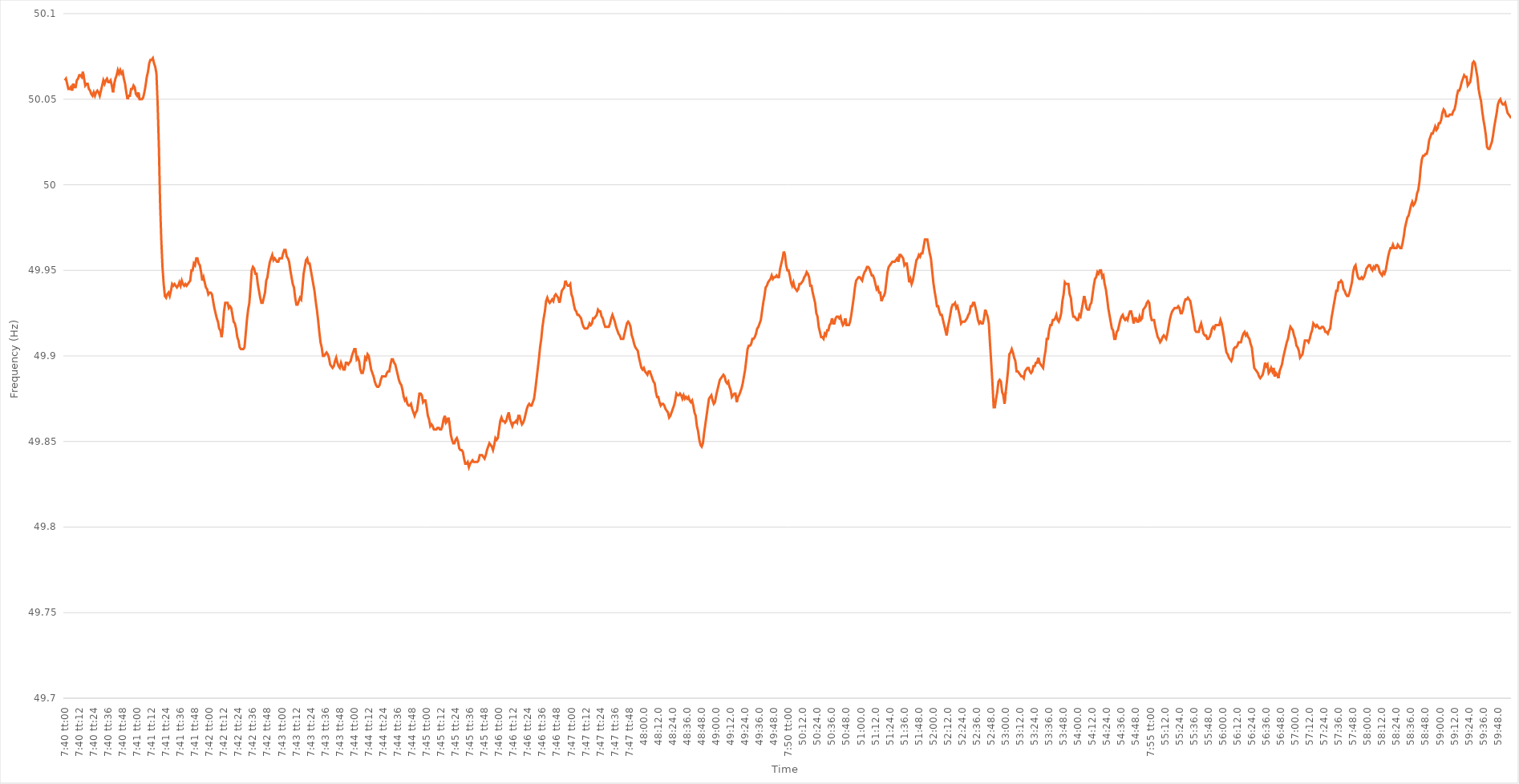
| Category | Series 0 |
|---|---|
| 0.3194444444444445 | 50.061 |
| 0.3194560185185185 | 50.062 |
| 0.31946759259259255 | 50.059 |
| 0.3194791666666667 | 50.056 |
| 0.31949074074074074 | 50.056 |
| 0.31950231481481484 | 50.057 |
| 0.3195138888888889 | 50.055 |
| 0.31952546296296297 | 50.059 |
| 0.319537037037037 | 50.057 |
| 0.3195486111111111 | 50.057 |
| 0.3195601851851852 | 50.061 |
| 0.31957175925925924 | 50.062 |
| 0.31958333333333333 | 50.064 |
| 0.3195949074074074 | 50.064 |
| 0.31960648148148146 | 50.063 |
| 0.31961805555555556 | 50.066 |
| 0.31962962962962965 | 50.062 |
| 0.3196412037037037 | 50.058 |
| 0.3196527777777778 | 50.059 |
| 0.3196643518518519 | 50.059 |
| 0.3196759259259259 | 50.056 |
| 0.3196875 | 50.055 |
| 0.3196990740740741 | 50.053 |
| 0.31971064814814815 | 50.052 |
| 0.31972222222222224 | 50.054 |
| 0.3197337962962963 | 50.052 |
| 0.3197453703703704 | 50.054 |
| 0.3197569444444444 | 50.055 |
| 0.3197685185185185 | 50.054 |
| 0.3197800925925926 | 50.052 |
| 0.31979166666666664 | 50.055 |
| 0.31980324074074074 | 50.058 |
| 0.31981481481481483 | 50.061 |
| 0.31982638888888887 | 50.059 |
| 0.31983796296296296 | 50.061 |
| 0.31984953703703706 | 50.062 |
| 0.3198611111111111 | 50.06 |
| 0.3198726851851852 | 50.06 |
| 0.3198842592592593 | 50.061 |
| 0.3198958333333333 | 50.058 |
| 0.3199074074074074 | 50.054 |
| 0.3199189814814815 | 50.059 |
| 0.31993055555555555 | 50.062 |
| 0.31994212962962965 | 50.064 |
| 0.3199537037037037 | 50.067 |
| 0.3199652777777778 | 50.065 |
| 0.3199768518518518 | 50.067 |
| 0.3199884259259259 | 50.065 |
| 0.32 | 50.066 |
| 0.32001157407407405 | 50.062 |
| 0.32002314814814814 | 50.059 |
| 0.32003472222222223 | 50.054 |
| 0.3200462962962963 | 50.05 |
| 0.32005787037037037 | 50.052 |
| 0.32006944444444446 | 50.052 |
| 0.3200810185185185 | 50.056 |
| 0.3200925925925926 | 50.056 |
| 0.3201041666666667 | 50.058 |
| 0.32011574074074073 | 50.057 |
| 0.3201273148148148 | 50.053 |
| 0.3201388888888889 | 50.052 |
| 0.32015046296296296 | 50.054 |
| 0.32016203703703705 | 50.05 |
| 0.3201736111111111 | 50.05 |
| 0.3201851851851852 | 50.05 |
| 0.3201967592592592 | 50.051 |
| 0.3202083333333334 | 50.054 |
| 0.3202199074074074 | 50.058 |
| 0.32023148148148145 | 50.063 |
| 0.32024305555555554 | 50.066 |
| 0.32025462962962964 | 50.071 |
| 0.3202662037037037 | 50.073 |
| 0.3202777777777778 | 50.073 |
| 0.32028935185185187 | 50.074 |
| 0.3203009259259259 | 50.071 |
| 0.3203125 | 50.069 |
| 0.3203240740740741 | 50.065 |
| 0.32033564814814813 | 50.047 |
| 0.3203472222222222 | 50.023 |
| 0.3203587962962963 | 49.99 |
| 0.32037037037037036 | 49.968 |
| 0.32038194444444446 | 49.952 |
| 0.32039351851851855 | 49.942 |
| 0.3204050925925926 | 49.935 |
| 0.3204166666666666 | 49.934 |
| 0.3204282407407408 | 49.936 |
| 0.3204398148148148 | 49.937 |
| 0.3204513888888889 | 49.935 |
| 0.32046296296296295 | 49.938 |
| 0.32047453703703704 | 49.942 |
| 0.3204861111111111 | 49.941 |
| 0.3204976851851852 | 49.942 |
| 0.32050925925925927 | 49.941 |
| 0.3205208333333333 | 49.94 |
| 0.3205324074074074 | 49.941 |
| 0.3205439814814815 | 49.943 |
| 0.32055555555555554 | 49.941 |
| 0.32056712962962963 | 49.944 |
| 0.3205787037037037 | 49.942 |
| 0.32059027777777777 | 49.941 |
| 0.32060185185185186 | 49.942 |
| 0.32061342592592595 | 49.941 |
| 0.320625 | 49.942 |
| 0.3206365740740741 | 49.943 |
| 0.3206481481481482 | 49.944 |
| 0.3206597222222222 | 49.95 |
| 0.3206712962962963 | 49.95 |
| 0.32068287037037035 | 49.954 |
| 0.32069444444444445 | 49.953 |
| 0.3207060185185185 | 49.957 |
| 0.3207175925925926 | 49.957 |
| 0.3207291666666667 | 49.954 |
| 0.3207407407407407 | 49.953 |
| 0.3207523148148148 | 49.949 |
| 0.3207638888888889 | 49.944 |
| 0.32077546296296294 | 49.946 |
| 0.32078703703703704 | 49.943 |
| 0.32079861111111113 | 49.94 |
| 0.32081018518518517 | 49.939 |
| 0.32082175925925926 | 49.936 |
| 0.32083333333333336 | 49.937 |
| 0.3208449074074074 | 49.937 |
| 0.3208564814814815 | 49.936 |
| 0.3208680555555556 | 49.932 |
| 0.3208796296296296 | 49.928 |
| 0.3208912037037037 | 49.925 |
| 0.32090277777777776 | 49.922 |
| 0.32091435185185185 | 49.92 |
| 0.3209259259259259 | 49.916 |
| 0.3209375 | 49.915 |
| 0.3209490740740741 | 49.911 |
| 0.3209606481481481 | 49.917 |
| 0.3209722222222222 | 49.926 |
| 0.3209837962962963 | 49.931 |
| 0.32099537037037035 | 49.931 |
| 0.32100694444444444 | 49.931 |
| 0.32101851851851854 | 49.928 |
| 0.3210300925925926 | 49.929 |
| 0.32104166666666667 | 49.928 |
| 0.32105324074074076 | 49.924 |
| 0.3210648148148148 | 49.92 |
| 0.3210763888888889 | 49.919 |
| 0.321087962962963 | 49.916 |
| 0.32109953703703703 | 49.911 |
| 0.3211111111111111 | 49.909 |
| 0.32112268518518516 | 49.905 |
| 0.32113425925925926 | 49.904 |
| 0.3211458333333333 | 49.904 |
| 0.32115740740740745 | 49.904 |
| 0.3211689814814815 | 49.905 |
| 0.3211805555555555 | 49.913 |
| 0.3211921296296296 | 49.921 |
| 0.3212037037037037 | 49.927 |
| 0.32121527777777775 | 49.931 |
| 0.32122685185185185 | 49.94 |
| 0.32123842592592594 | 49.95 |
| 0.32125 | 49.952 |
| 0.3212615740740741 | 49.951 |
| 0.32127314814814817 | 49.948 |
| 0.3212847222222222 | 49.948 |
| 0.3212962962962963 | 49.942 |
| 0.3213078703703704 | 49.938 |
| 0.32131944444444444 | 49.934 |
| 0.32133101851851853 | 49.931 |
| 0.3213425925925926 | 49.931 |
| 0.32135416666666666 | 49.934 |
| 0.3213657407407407 | 49.937 |
| 0.32137731481481485 | 49.944 |
| 0.3213888888888889 | 49.946 |
| 0.321400462962963 | 49.951 |
| 0.321412037037037 | 49.955 |
| 0.3214236111111111 | 49.957 |
| 0.32143518518518516 | 49.959 |
| 0.32144675925925925 | 49.956 |
| 0.32145833333333335 | 49.957 |
| 0.3214699074074074 | 49.956 |
| 0.3214814814814815 | 49.955 |
| 0.3214930555555556 | 49.955 |
| 0.3215046296296296 | 49.957 |
| 0.3215162037037037 | 49.957 |
| 0.3215277777777778 | 49.957 |
| 0.32153935185185184 | 49.96 |
| 0.32155092592592593 | 49.962 |
| 0.32156250000000003 | 49.962 |
| 0.32157407407407407 | 49.958 |
| 0.32158564814814816 | 49.957 |
| 0.32159722222222226 | 49.955 |
| 0.3216087962962963 | 49.95 |
| 0.3216203703703704 | 49.946 |
| 0.32163194444444443 | 49.942 |
| 0.3216435185185185 | 49.94 |
| 0.32165509259259256 | 49.934 |
| 0.32166666666666666 | 49.93 |
| 0.32167824074074075 | 49.93 |
| 0.3216898148148148 | 49.932 |
| 0.3217013888888889 | 49.934 |
| 0.321712962962963 | 49.933 |
| 0.321724537037037 | 49.94 |
| 0.3217361111111111 | 49.948 |
| 0.3217476851851852 | 49.952 |
| 0.32175925925925924 | 49.956 |
| 0.32177083333333334 | 49.957 |
| 0.32178240740740743 | 49.954 |
| 0.3217939814814815 | 49.954 |
| 0.32180555555555557 | 49.95 |
| 0.32181712962962966 | 49.946 |
| 0.3218287037037037 | 49.942 |
| 0.3218402777777778 | 49.938 |
| 0.32185185185185183 | 49.932 |
| 0.32186342592592593 | 49.927 |
| 0.32187499999999997 | 49.921 |
| 0.32188657407407406 | 49.914 |
| 0.32189814814814816 | 49.908 |
| 0.3219097222222222 | 49.905 |
| 0.3219212962962963 | 49.9 |
| 0.3219328703703704 | 49.9 |
| 0.3219444444444444 | 49.901 |
| 0.3219560185185185 | 49.902 |
| 0.3219675925925926 | 49.901 |
| 0.32197916666666665 | 49.899 |
| 0.32199074074074074 | 49.895 |
| 0.32200231481481484 | 49.894 |
| 0.3220138888888889 | 49.893 |
| 0.32202546296296297 | 49.894 |
| 0.32203703703703707 | 49.897 |
| 0.3220486111111111 | 49.899 |
| 0.3220601851851852 | 49.896 |
| 0.32207175925925924 | 49.894 |
| 0.32208333333333333 | 49.893 |
| 0.32209490740740737 | 49.896 |
| 0.3221064814814815 | 49.894 |
| 0.32211805555555556 | 49.892 |
| 0.3221296296296296 | 49.892 |
| 0.3221412037037037 | 49.896 |
| 0.3221527777777778 | 49.896 |
| 0.3221643518518518 | 49.895 |
| 0.3221759259259259 | 49.896 |
| 0.3221875 | 49.897 |
| 0.32219907407407405 | 49.9 |
| 0.32221064814814815 | 49.902 |
| 0.32222222222222224 | 49.904 |
| 0.3222337962962963 | 49.904 |
| 0.3222453703703704 | 49.898 |
| 0.32225694444444447 | 49.899 |
| 0.3222685185185185 | 49.897 |
| 0.3222800925925926 | 49.892 |
| 0.3222916666666667 | 49.89 |
| 0.32230324074074074 | 49.89 |
| 0.3223148148148148 | 49.893 |
| 0.3223263888888889 | 49.899 |
| 0.32233796296296297 | 49.898 |
| 0.322349537037037 | 49.901 |
| 0.3223611111111111 | 49.9 |
| 0.3223726851851852 | 49.896 |
| 0.32238425925925923 | 49.892 |
| 0.3223958333333333 | 49.89 |
| 0.3224074074074074 | 49.888 |
| 0.32241898148148146 | 49.885 |
| 0.32243055555555555 | 49.883 |
| 0.32244212962962965 | 49.882 |
| 0.3224537037037037 | 49.882 |
| 0.3224652777777778 | 49.883 |
| 0.3224768518518519 | 49.886 |
| 0.3224884259259259 | 49.888 |
| 0.3225 | 49.888 |
| 0.3225115740740741 | 49.888 |
| 0.32252314814814814 | 49.888 |
| 0.32253472222222224 | 49.89 |
| 0.32254629629629633 | 49.891 |
| 0.32255787037037037 | 49.891 |
| 0.32256944444444446 | 49.895 |
| 0.3225810185185185 | 49.898 |
| 0.3225925925925926 | 49.898 |
| 0.32260416666666664 | 49.896 |
| 0.32261574074074073 | 49.895 |
| 0.3226273148148148 | 49.892 |
| 0.32263888888888886 | 49.889 |
| 0.32265046296296296 | 49.886 |
| 0.32266203703703705 | 49.884 |
| 0.3226736111111111 | 49.883 |
| 0.3226851851851852 | 49.88 |
| 0.3226967592592593 | 49.876 |
| 0.3227083333333333 | 49.874 |
| 0.3227199074074074 | 49.875 |
| 0.3227314814814815 | 49.872 |
| 0.32274305555555555 | 49.871 |
| 0.32275462962962964 | 49.871 |
| 0.32276620370370374 | 49.872 |
| 0.3227777777777778 | 49.869 |
| 0.32278935185185187 | 49.867 |
| 0.3228009259259259 | 49.865 |
| 0.3228125 | 49.867 |
| 0.32282407407407404 | 49.868 |
| 0.32283564814814814 | 49.873 |
| 0.32284722222222223 | 49.878 |
| 0.32285879629629627 | 49.878 |
| 0.32287037037037036 | 49.877 |
| 0.32288194444444446 | 49.873 |
| 0.3228935185185185 | 49.874 |
| 0.3229050925925926 | 49.874 |
| 0.3229166666666667 | 49.87 |
| 0.3229282407407407 | 49.865 |
| 0.3229398148148148 | 49.863 |
| 0.3229513888888889 | 49.859 |
| 0.32296296296296295 | 49.86 |
| 0.32297453703703705 | 49.859 |
| 0.32298611111111114 | 49.857 |
| 0.3229976851851852 | 49.857 |
| 0.3230092592592593 | 49.857 |
| 0.3230208333333333 | 49.858 |
| 0.3230324074074074 | 49.858 |
| 0.32304398148148145 | 49.857 |
| 0.3230555555555556 | 49.857 |
| 0.32306712962962963 | 49.859 |
| 0.3230787037037037 | 49.863 |
| 0.32309027777777777 | 49.865 |
| 0.32310185185185186 | 49.861 |
| 0.3231134259259259 | 49.862 |
| 0.323125 | 49.864 |
| 0.3231365740740741 | 49.86 |
| 0.32314814814814813 | 49.854 |
| 0.3231597222222222 | 49.851 |
| 0.3231712962962963 | 49.849 |
| 0.32318287037037036 | 49.849 |
| 0.32319444444444445 | 49.851 |
| 0.32320601851851855 | 49.852 |
| 0.3232175925925926 | 49.85 |
| 0.3232291666666667 | 49.846 |
| 0.3232407407407408 | 49.845 |
| 0.3232523148148148 | 49.845 |
| 0.32326388888888885 | 49.844 |
| 0.323275462962963 | 49.84 |
| 0.32328703703703704 | 49.837 |
| 0.3232986111111111 | 49.837 |
| 0.3233101851851852 | 49.838 |
| 0.32332175925925927 | 49.835 |
| 0.3233333333333333 | 49.837 |
| 0.3233449074074074 | 49.838 |
| 0.3233564814814815 | 49.839 |
| 0.32336805555555553 | 49.838 |
| 0.32337962962962963 | 49.838 |
| 0.3233912037037037 | 49.838 |
| 0.32340277777777776 | 49.838 |
| 0.32341435185185186 | 49.839 |
| 0.32342592592592595 | 49.842 |
| 0.3234375 | 49.842 |
| 0.3234490740740741 | 49.842 |
| 0.3234606481481482 | 49.841 |
| 0.3234722222222222 | 49.84 |
| 0.3234837962962963 | 49.842 |
| 0.3234953703703704 | 49.845 |
| 0.32350694444444444 | 49.847 |
| 0.32351851851851854 | 49.849 |
| 0.3235300925925926 | 49.848 |
| 0.32354166666666667 | 49.847 |
| 0.3235532407407407 | 49.845 |
| 0.3235648148148148 | 49.848 |
| 0.3235763888888889 | 49.852 |
| 0.32358796296296294 | 49.851 |
| 0.32359953703703703 | 49.852 |
| 0.3236111111111111 | 49.857 |
| 0.32362268518518517 | 49.862 |
| 0.32363425925925926 | 49.864 |
| 0.32364583333333335 | 49.862 |
| 0.3236574074074074 | 49.862 |
| 0.3236689814814815 | 49.861 |
| 0.3236805555555556 | 49.862 |
| 0.3236921296296296 | 49.865 |
| 0.3237037037037037 | 49.867 |
| 0.3237152777777778 | 49.863 |
| 0.32372685185185185 | 49.861 |
| 0.32373842592592594 | 49.859 |
| 0.32375 | 49.861 |
| 0.3237615740740741 | 49.861 |
| 0.3237731481481481 | 49.862 |
| 0.3237847222222222 | 49.861 |
| 0.3237962962962963 | 49.865 |
| 0.32380787037037034 | 49.865 |
| 0.32381944444444444 | 49.862 |
| 0.32383101851851853 | 49.86 |
| 0.32384259259259257 | 49.861 |
| 0.32385416666666667 | 49.863 |
| 0.32386574074074076 | 49.866 |
| 0.3238773148148148 | 49.869 |
| 0.3238888888888889 | 49.871 |
| 0.323900462962963 | 49.872 |
| 0.323912037037037 | 49.871 |
| 0.3239236111111111 | 49.871 |
| 0.3239351851851852 | 49.873 |
| 0.32394675925925925 | 49.875 |
| 0.32395833333333335 | 49.88 |
| 0.3239699074074074 | 49.886 |
| 0.3239814814814815 | 49.892 |
| 0.3239930555555555 | 49.898 |
| 0.32400462962962967 | 49.905 |
| 0.3240162037037037 | 49.91 |
| 0.32402777777777775 | 49.917 |
| 0.32403935185185184 | 49.922 |
| 0.32405092592592594 | 49.926 |
| 0.3240625 | 49.932 |
| 0.32407407407407407 | 49.934 |
| 0.32408564814814816 | 49.932 |
| 0.3240972222222222 | 49.931 |
| 0.3241087962962963 | 49.932 |
| 0.3241203703703704 | 49.933 |
| 0.32413194444444443 | 49.932 |
| 0.3241435185185185 | 49.935 |
| 0.3241550925925926 | 49.936 |
| 0.32416666666666666 | 49.935 |
| 0.32417824074074075 | 49.934 |
| 0.32418981481481485 | 49.931 |
| 0.3242013888888889 | 49.934 |
| 0.3242129629629629 | 49.938 |
| 0.3242245370370371 | 49.939 |
| 0.3242361111111111 | 49.94 |
| 0.32424768518518515 | 49.944 |
| 0.32425925925925925 | 49.942 |
| 0.32427083333333334 | 49.941 |
| 0.3242824074074074 | 49.941 |
| 0.3242939814814815 | 49.942 |
| 0.32430555555555557 | 49.936 |
| 0.3243171296296296 | 49.934 |
| 0.3243287037037037 | 49.93 |
| 0.3243402777777778 | 49.927 |
| 0.32435185185185184 | 49.926 |
| 0.32436342592592593 | 49.924 |
| 0.324375 | 49.924 |
| 0.32438657407407406 | 49.923 |
| 0.32439814814814816 | 49.922 |
| 0.32440972222222225 | 49.919 |
| 0.3244212962962963 | 49.917 |
| 0.32443287037037033 | 49.916 |
| 0.3244444444444445 | 49.916 |
| 0.3244560185185185 | 49.916 |
| 0.3244675925925926 | 49.917 |
| 0.32447916666666665 | 49.919 |
| 0.32449074074074075 | 49.918 |
| 0.3245023148148148 | 49.919 |
| 0.3245138888888889 | 49.922 |
| 0.324525462962963 | 49.922 |
| 0.324537037037037 | 49.923 |
| 0.3245486111111111 | 49.924 |
| 0.3245601851851852 | 49.927 |
| 0.32457175925925924 | 49.926 |
| 0.32458333333333333 | 49.926 |
| 0.32459490740740743 | 49.923 |
| 0.32460648148148147 | 49.922 |
| 0.32461805555555556 | 49.919 |
| 0.32462962962962966 | 49.917 |
| 0.3246412037037037 | 49.917 |
| 0.3246527777777778 | 49.917 |
| 0.3246643518518519 | 49.917 |
| 0.3246759259259259 | 49.919 |
| 0.3246875 | 49.922 |
| 0.32469907407407406 | 49.924 |
| 0.32471064814814815 | 49.922 |
| 0.3247222222222222 | 49.92 |
| 0.3247337962962963 | 49.917 |
| 0.3247453703703704 | 49.915 |
| 0.3247569444444444 | 49.913 |
| 0.3247685185185185 | 49.912 |
| 0.3247800925925926 | 49.91 |
| 0.32479166666666665 | 49.91 |
| 0.32480324074074074 | 49.91 |
| 0.32481481481481483 | 49.913 |
| 0.3248263888888889 | 49.916 |
| 0.32483796296296297 | 49.919 |
| 0.32484953703703706 | 49.92 |
| 0.3248611111111111 | 49.919 |
| 0.3248726851851852 | 49.917 |
| 0.3248842592592593 | 49.912 |
| 0.32489583333333333 | 49.91 |
| 0.3249074074074074 | 49.907 |
| 0.32491898148148146 | 49.905 |
| 0.32493055555555556 | 49.904 |
| 0.3249421296296296 | 49.903 |
| 0.3249537037037037 | 49.899 |
| 0.3249652777777778 | 49.896 |
| 0.3249768518518518 | 49.893 |
| 0.3249884259259259 | 49.892 |
| 0.325 | 49.893 |
| 0.32501157407407405 | 49.891 |
| 0.32502314814814814 | 49.89 |
| 0.32503472222222224 | 49.889 |
| 0.3250462962962963 | 49.891 |
| 0.32505787037037037 | 49.891 |
| 0.32506944444444447 | 49.889 |
| 0.3250810185185185 | 49.887 |
| 0.3250925925925926 | 49.885 |
| 0.3251041666666667 | 49.884 |
| 0.32511574074074073 | 49.879 |
| 0.3251273148148148 | 49.876 |
| 0.3251388888888889 | 49.876 |
| 0.32515046296296296 | 49.873 |
| 0.325162037037037 | 49.871 |
| 0.32517361111111115 | 49.872 |
| 0.3251851851851852 | 49.872 |
| 0.3251967592592592 | 49.871 |
| 0.3252083333333333 | 49.869 |
| 0.3252199074074074 | 49.868 |
| 0.32523148148148145 | 49.867 |
| 0.32524305555555555 | 49.864 |
| 0.32525462962962964 | 49.865 |
| 0.3252662037037037 | 49.867 |
| 0.3252777777777778 | 49.869 |
| 0.32528935185185187 | 49.871 |
| 0.3253009259259259 | 49.874 |
| 0.3253125 | 49.878 |
| 0.3253240740740741 | 49.877 |
| 0.32533564814814814 | 49.877 |
| 0.32534722222222223 | 49.878 |
| 0.3253587962962963 | 49.877 |
| 0.32537037037037037 | 49.875 |
| 0.3253819444444444 | 49.877 |
| 0.32539351851851855 | 49.875 |
| 0.3254050925925926 | 49.876 |
| 0.3254166666666667 | 49.875 |
| 0.3254282407407407 | 49.876 |
| 0.3254398148148148 | 49.874 |
| 0.32545138888888886 | 49.873 |
| 0.32546296296296295 | 49.874 |
| 0.32547453703703705 | 49.871 |
| 0.3254861111111111 | 49.867 |
| 0.3254976851851852 | 49.865 |
| 0.3255092592592593 | 49.859 |
| 0.3255208333333333 | 49.856 |
| 0.3255324074074074 | 49.851 |
| 0.3255439814814815 | 49.848 |
| 0.32555555555555554 | 49.847 |
| 0.32556712962962964 | 49.849 |
| 0.32557870370370373 | 49.855 |
| 0.32559027777777777 | 49.86 |
| 0.32560185185185186 | 49.865 |
| 0.32561342592592596 | 49.87 |
| 0.325625 | 49.875 |
| 0.3256365740740741 | 49.876 |
| 0.32564814814814813 | 49.877 |
| 0.3256597222222222 | 49.874 |
| 0.32567129629629626 | 49.872 |
| 0.32568287037037036 | 49.873 |
| 0.32569444444444445 | 49.877 |
| 0.3257060185185185 | 49.88 |
| 0.3257175925925926 | 49.883 |
| 0.3257291666666667 | 49.886 |
| 0.3257407407407407 | 49.887 |
| 0.3257523148148148 | 49.888 |
| 0.3257638888888889 | 49.889 |
| 0.32577546296296295 | 49.888 |
| 0.32578703703703704 | 49.885 |
| 0.32579861111111114 | 49.884 |
| 0.3258101851851852 | 49.885 |
| 0.32582175925925927 | 49.882 |
| 0.32583333333333336 | 49.88 |
| 0.3258449074074074 | 49.876 |
| 0.3258564814814815 | 49.877 |
| 0.32586805555555554 | 49.878 |
| 0.32587962962962963 | 49.878 |
| 0.32589120370370367 | 49.873 |
| 0.32590277777777776 | 49.876 |
| 0.32591435185185186 | 49.877 |
| 0.3259259259259259 | 49.879 |
| 0.3259375 | 49.881 |
| 0.3259490740740741 | 49.884 |
| 0.3259606481481481 | 49.888 |
| 0.3259722222222222 | 49.892 |
| 0.3259837962962963 | 49.898 |
| 0.32599537037037035 | 49.904 |
| 0.32600694444444445 | 49.906 |
| 0.32601851851851854 | 49.906 |
| 0.3260300925925926 | 49.907 |
| 0.3260416666666667 | 49.91 |
| 0.32605324074074077 | 49.91 |
| 0.3260648148148148 | 49.911 |
| 0.3260763888888889 | 49.913 |
| 0.326087962962963 | 49.916 |
| 0.32609953703703703 | 49.917 |
| 0.3261111111111111 | 49.919 |
| 0.3261226851851852 | 49.921 |
| 0.32613425925925926 | 49.926 |
| 0.3261458333333333 | 49.931 |
| 0.3261574074074074 | 49.935 |
| 0.3261689814814815 | 49.94 |
| 0.32618055555555553 | 49.941 |
| 0.3261921296296296 | 49.943 |
| 0.3262037037037037 | 49.944 |
| 0.32621527777777776 | 49.945 |
| 0.32622685185185185 | 49.947 |
| 0.32623842592592595 | 49.945 |
| 0.32625 | 49.946 |
| 0.3262615740740741 | 49.946 |
| 0.3262731481481482 | 49.947 |
| 0.3262847222222222 | 49.946 |
| 0.3262962962962963 | 49.946 |
| 0.3263078703703704 | 49.951 |
| 0.32631944444444444 | 49.954 |
| 0.3263310185185185 | 49.957 |
| 0.32634259259259263 | 49.961 |
| 0.32635416666666667 | 49.959 |
| 0.32636574074074076 | 49.953 |
| 0.3263773148148148 | 49.95 |
| 0.3263888888888889 | 49.95 |
| 0.32640046296296293 | 49.947 |
| 0.32641203703703703 | 49.943 |
| 0.3264236111111111 | 49.941 |
| 0.32643518518518516 | 49.943 |
| 0.32644675925925926 | 49.94 |
| 0.32645833333333335 | 49.939 |
| 0.3264699074074074 | 49.938 |
| 0.3264814814814815 | 49.939 |
| 0.3264930555555556 | 49.942 |
| 0.3265046296296296 | 49.942 |
| 0.3265162037037037 | 49.943 |
| 0.3265277777777778 | 49.944 |
| 0.32653935185185184 | 49.946 |
| 0.32655092592592594 | 49.947 |
| 0.32656250000000003 | 49.949 |
| 0.32657407407407407 | 49.948 |
| 0.32658564814814817 | 49.946 |
| 0.3265972222222222 | 49.941 |
| 0.3266087962962963 | 49.941 |
| 0.32662037037037034 | 49.937 |
| 0.32663194444444443 | 49.934 |
| 0.3266435185185185 | 49.931 |
| 0.32665509259259257 | 49.925 |
| 0.32666666666666666 | 49.923 |
| 0.32667824074074076 | 49.917 |
| 0.3266898148148148 | 49.914 |
| 0.3267013888888889 | 49.911 |
| 0.326712962962963 | 49.911 |
| 0.326724537037037 | 49.91 |
| 0.3267361111111111 | 49.913 |
| 0.3267476851851852 | 49.912 |
| 0.32675925925925925 | 49.915 |
| 0.32677083333333334 | 49.915 |
| 0.32678240740740744 | 49.918 |
| 0.3267939814814815 | 49.919 |
| 0.32680555555555557 | 49.922 |
| 0.3268171296296296 | 49.919 |
| 0.3268287037037037 | 49.919 |
| 0.32684027777777774 | 49.922 |
| 0.32685185185185184 | 49.923 |
| 0.32686342592592593 | 49.923 |
| 0.32687499999999997 | 49.922 |
| 0.32688657407407407 | 49.923 |
| 0.32689814814814816 | 49.92 |
| 0.3269097222222222 | 49.918 |
| 0.3269212962962963 | 49.919 |
| 0.3269328703703704 | 49.922 |
| 0.3269444444444444 | 49.918 |
| 0.3269560185185185 | 49.918 |
| 0.3269675925925926 | 49.918 |
| 0.32697916666666665 | 49.92 |
| 0.32699074074074075 | 49.924 |
| 0.32700231481481484 | 49.929 |
| 0.3270138888888889 | 49.934 |
| 0.327025462962963 | 49.94 |
| 0.327037037037037 | 49.944 |
| 0.3270486111111111 | 49.945 |
| 0.32706018518518515 | 49.946 |
| 0.3270717592592593 | 49.946 |
| 0.32708333333333334 | 49.945 |
| 0.3270949074074074 | 49.944 |
| 0.32710648148148147 | 49.947 |
| 0.32711805555555556 | 49.949 |
| 0.3271296296296296 | 49.95 |
| 0.3271412037037037 | 49.952 |
| 0.3271527777777778 | 49.952 |
| 0.32716435185185183 | 49.951 |
| 0.3271759259259259 | 49.949 |
| 0.3271875 | 49.947 |
| 0.32719907407407406 | 49.947 |
| 0.32721064814814815 | 49.945 |
| 0.32722222222222225 | 49.942 |
| 0.3272337962962963 | 49.939 |
| 0.3272453703703704 | 49.94 |
| 0.3272569444444445 | 49.937 |
| 0.3272685185185185 | 49.937 |
| 0.32728009259259255 | 49.932 |
| 0.3272916666666667 | 49.934 |
| 0.32730324074074074 | 49.935 |
| 0.32731481481481484 | 49.937 |
| 0.3273263888888889 | 49.943 |
| 0.32733796296296297 | 49.949 |
| 0.327349537037037 | 49.952 |
| 0.3273611111111111 | 49.953 |
| 0.3273726851851852 | 49.954 |
| 0.32738425925925924 | 49.955 |
| 0.32739583333333333 | 49.955 |
| 0.3274074074074074 | 49.955 |
| 0.32741898148148146 | 49.956 |
| 0.32743055555555556 | 49.957 |
| 0.32744212962962965 | 49.955 |
| 0.3274537037037037 | 49.959 |
| 0.3274652777777778 | 49.959 |
| 0.3274768518518519 | 49.958 |
| 0.3274884259259259 | 49.957 |
| 0.3275 | 49.953 |
| 0.3275115740740741 | 49.954 |
| 0.32752314814814815 | 49.954 |
| 0.32753472222222224 | 49.949 |
| 0.3275462962962963 | 49.943 |
| 0.3275578703703704 | 49.945 |
| 0.3275694444444444 | 49.942 |
| 0.3275810185185185 | 49.944 |
| 0.3275925925925926 | 49.948 |
| 0.32760416666666664 | 49.952 |
| 0.32761574074074074 | 49.956 |
| 0.32762731481481483 | 49.957 |
| 0.32763888888888887 | 49.959 |
| 0.32765046296296296 | 49.958 |
| 0.32766203703703706 | 49.96 |
| 0.3276736111111111 | 49.96 |
| 0.3276851851851852 | 49.964 |
| 0.3276967592592593 | 49.968 |
| 0.3277083333333333 | 49.968 |
| 0.3277199074074074 | 49.968 |
| 0.3277314814814815 | 49.964 |
| 0.32774305555555555 | 49.96 |
| 0.32775462962962965 | 49.957 |
| 0.3277662037037037 | 49.95 |
| 0.3277777777777778 | 49.943 |
| 0.3277893518518518 | 49.938 |
| 0.3278009259259259 | 49.934 |
| 0.3278125 | 49.929 |
| 0.32782407407407405 | 49.929 |
| 0.32783564814814814 | 49.926 |
| 0.32784722222222223 | 49.924 |
| 0.3278587962962963 | 49.924 |
| 0.32787037037037037 | 49.921 |
| 0.32788194444444446 | 49.918 |
| 0.3278935185185185 | 49.915 |
| 0.3279050925925926 | 49.912 |
| 0.3279166666666667 | 49.917 |
| 0.32792824074074073 | 49.92 |
| 0.3279398148148148 | 49.924 |
| 0.3279513888888889 | 49.928 |
| 0.32796296296296296 | 49.93 |
| 0.32797453703703705 | 49.93 |
| 0.3279861111111111 | 49.931 |
| 0.3279976851851852 | 49.928 |
| 0.3280092592592592 | 49.929 |
| 0.3280208333333334 | 49.926 |
| 0.3280324074074074 | 49.923 |
| 0.32804398148148145 | 49.919 |
| 0.32805555555555554 | 49.92 |
| 0.32806712962962964 | 49.92 |
| 0.3280787037037037 | 49.92 |
| 0.3280902777777778 | 49.921 |
| 0.32810185185185187 | 49.922 |
| 0.3281134259259259 | 49.924 |
| 0.328125 | 49.925 |
| 0.3281365740740741 | 49.929 |
| 0.32814814814814813 | 49.929 |
| 0.3281597222222222 | 49.931 |
| 0.3281712962962963 | 49.931 |
| 0.32818287037037036 | 49.928 |
| 0.32819444444444446 | 49.925 |
| 0.32820601851851855 | 49.921 |
| 0.3282175925925926 | 49.919 |
| 0.3282291666666666 | 49.92 |
| 0.3282407407407408 | 49.919 |
| 0.3282523148148148 | 49.919 |
| 0.3282638888888889 | 49.922 |
| 0.32827546296296295 | 49.927 |
| 0.32828703703703704 | 49.925 |
| 0.3282986111111111 | 49.923 |
| 0.3283101851851852 | 49.919 |
| 0.32832175925925927 | 49.907 |
| 0.3283333333333333 | 49.896 |
| 0.3283449074074074 | 49.884 |
| 0.3283564814814815 | 49.87 |
| 0.32836805555555554 | 49.87 |
| 0.32837962962962963 | 49.875 |
| 0.3283912037037037 | 49.879 |
| 0.32840277777777777 | 49.885 |
| 0.32841435185185186 | 49.886 |
| 0.32842592592592595 | 49.885 |
| 0.3284375 | 49.879 |
| 0.3284490740740741 | 49.877 |
| 0.3284606481481482 | 49.872 |
| 0.3284722222222222 | 49.879 |
| 0.3284837962962963 | 49.885 |
| 0.32849537037037035 | 49.892 |
| 0.32850694444444445 | 49.901 |
| 0.3285185185185185 | 49.902 |
| 0.3285300925925926 | 49.904 |
| 0.3285416666666667 | 49.902 |
| 0.3285532407407407 | 49.899 |
| 0.3285648148148148 | 49.897 |
| 0.3285763888888889 | 49.891 |
| 0.32858796296296294 | 49.891 |
| 0.32859953703703704 | 49.89 |
| 0.32861111111111113 | 49.889 |
| 0.32862268518518517 | 49.888 |
| 0.32863425925925926 | 49.888 |
| 0.32864583333333336 | 49.887 |
| 0.3286574074074074 | 49.891 |
| 0.3286689814814815 | 49.892 |
| 0.3286805555555556 | 49.893 |
| 0.3286921296296296 | 49.893 |
| 0.3287037037037037 | 49.891 |
| 0.32871527777777776 | 49.89 |
| 0.32872685185185185 | 49.891 |
| 0.3287384259259259 | 49.894 |
| 0.32875 | 49.894 |
| 0.3287615740740741 | 49.896 |
| 0.3287731481481481 | 49.896 |
| 0.3287847222222222 | 49.899 |
| 0.3287962962962963 | 49.896 |
| 0.32880787037037035 | 49.895 |
| 0.32881944444444444 | 49.894 |
| 0.32883101851851854 | 49.893 |
| 0.3288425925925926 | 49.899 |
| 0.32885416666666667 | 49.903 |
| 0.32886574074074076 | 49.91 |
| 0.3288773148148148 | 49.91 |
| 0.3288888888888889 | 49.915 |
| 0.328900462962963 | 49.918 |
| 0.32891203703703703 | 49.918 |
| 0.3289236111111111 | 49.921 |
| 0.32893518518518516 | 49.921 |
| 0.32894675925925926 | 49.922 |
| 0.3289583333333333 | 49.924 |
| 0.32896990740740745 | 49.921 |
| 0.3289814814814815 | 49.92 |
| 0.3289930555555555 | 49.922 |
| 0.3290046296296296 | 49.925 |
| 0.3290162037037037 | 49.932 |
| 0.32902777777777775 | 49.936 |
| 0.32903935185185185 | 49.943 |
| 0.32905092592592594 | 49.942 |
| 0.3290625 | 49.942 |
| 0.3290740740740741 | 49.942 |
| 0.32908564814814817 | 49.936 |
| 0.3290972222222222 | 49.934 |
| 0.3291087962962963 | 49.927 |
| 0.3291203703703704 | 49.923 |
| 0.32913194444444444 | 49.923 |
| 0.32914351851851853 | 49.922 |
| 0.3291550925925926 | 49.921 |
| 0.32916666666666666 | 49.921 |
| 0.3291782407407407 | 49.924 |
| 0.32918981481481485 | 49.923 |
| 0.3292013888888889 | 49.927 |
| 0.329212962962963 | 49.931 |
| 0.329224537037037 | 49.935 |
| 0.3292361111111111 | 49.932 |
| 0.32924768518518516 | 49.928 |
| 0.32925925925925925 | 49.927 |
| 0.32927083333333335 | 49.927 |
| 0.3292824074074074 | 49.93 |
| 0.3292939814814815 | 49.931 |
| 0.3293055555555556 | 49.936 |
| 0.3293171296296296 | 49.941 |
| 0.3293287037037037 | 49.945 |
| 0.3293402777777778 | 49.946 |
| 0.32935185185185184 | 49.949 |
| 0.32936342592592593 | 49.948 |
| 0.32937500000000003 | 49.95 |
| 0.32938657407407407 | 49.95 |
| 0.32939814814814816 | 49.946 |
| 0.32940972222222226 | 49.947 |
| 0.3294212962962963 | 49.942 |
| 0.3294328703703704 | 49.939 |
| 0.32944444444444443 | 49.934 |
| 0.3294560185185185 | 49.928 |
| 0.32946759259259256 | 49.924 |
| 0.32947916666666666 | 49.92 |
| 0.32949074074074075 | 49.916 |
| 0.3295023148148148 | 49.915 |
| 0.3295138888888889 | 49.91 |
| 0.329525462962963 | 49.91 |
| 0.329537037037037 | 49.914 |
| 0.3295486111111111 | 49.915 |
| 0.3295601851851852 | 49.918 |
| 0.32957175925925924 | 49.921 |
| 0.32958333333333334 | 49.923 |
| 0.32959490740740743 | 49.924 |
| 0.3296064814814815 | 49.922 |
| 0.32961805555555557 | 49.921 |
| 0.32962962962962966 | 49.922 |
| 0.3296412037037037 | 49.921 |
| 0.3296527777777778 | 49.924 |
| 0.32966435185185183 | 49.926 |
| 0.32967592592592593 | 49.926 |
| 0.32968749999999997 | 49.923 |
| 0.32969907407407406 | 49.919 |
| 0.32971064814814816 | 49.922 |
| 0.3297222222222222 | 49.922 |
| 0.3297337962962963 | 49.92 |
| 0.3297453703703704 | 49.92 |
| 0.3297569444444444 | 49.923 |
| 0.3297685185185185 | 49.921 |
| 0.3297800925925926 | 49.922 |
| 0.32979166666666665 | 49.927 |
| 0.32980324074074074 | 49.928 |
| 0.32981481481481484 | 49.929 |
| 0.3298263888888889 | 49.931 |
| 0.32983796296296297 | 49.932 |
| 0.32984953703703707 | 49.931 |
| 0.3298611111111111 | 49.924 |
| 0.3298726851851852 | 49.921 |
| 0.32988425925925924 | 49.921 |
| 0.32989583333333333 | 49.921 |
| 0.32990740740740737 | 49.917 |
| 0.3299189814814815 | 49.914 |
| 0.32993055555555556 | 49.911 |
| 0.3299421296296296 | 49.91 |
| 0.3299537037037037 | 49.908 |
| 0.3299652777777778 | 49.909 |
| 0.3299768518518518 | 49.911 |
| 0.3299884259259259 | 49.912 |
| 0.33 | 49.911 |
| 0.33001157407407405 | 49.91 |
| 0.33002314814814815 | 49.913 |
| 0.33003472222222224 | 49.917 |
| 0.3300462962962963 | 49.921 |
| 0.3300578703703704 | 49.924 |
| 0.33006944444444447 | 49.926 |
| 0.3300810185185185 | 49.927 |
| 0.3300925925925926 | 49.928 |
| 0.3301041666666667 | 49.928 |
| 0.33011574074074074 | 49.928 |
| 0.3301273148148148 | 49.929 |
| 0.3301388888888889 | 49.928 |
| 0.33015046296296297 | 49.925 |
| 0.330162037037037 | 49.925 |
| 0.3301736111111111 | 49.927 |
| 0.3301851851851852 | 49.931 |
| 0.33019675925925923 | 49.933 |
| 0.3302083333333333 | 49.933 |
| 0.3302199074074074 | 49.934 |
| 0.33023148148148146 | 49.933 |
| 0.33024305555555555 | 49.932 |
| 0.33025462962962965 | 49.928 |
| 0.3302662037037037 | 49.924 |
| 0.3302777777777778 | 49.92 |
| 0.3302893518518519 | 49.915 |
| 0.3303009259259259 | 49.914 |
| 0.3303125 | 49.914 |
| 0.3303240740740741 | 49.914 |
| 0.33033564814814814 | 49.917 |
| 0.33034722222222224 | 49.919 |
| 0.33035879629629633 | 49.916 |
| 0.33037037037037037 | 49.913 |
| 0.33038194444444446 | 49.912 |
| 0.3303935185185185 | 49.912 |
| 0.3304050925925926 | 49.91 |
| 0.33041666666666664 | 49.91 |
| 0.33042824074074073 | 49.911 |
| 0.3304398148148148 | 49.913 |
| 0.33045138888888886 | 49.916 |
| 0.33046296296296296 | 49.917 |
| 0.33047453703703705 | 49.916 |
| 0.3304861111111111 | 49.918 |
| 0.3304976851851852 | 49.918 |
| 0.3305092592592593 | 49.918 |
| 0.3305208333333333 | 49.918 |
| 0.3305324074074074 | 49.921 |
| 0.3305439814814815 | 49.919 |
| 0.33055555555555555 | 49.915 |
| 0.33056712962962964 | 49.911 |
| 0.33057870370370374 | 49.906 |
| 0.3305902777777778 | 49.902 |
| 0.33060185185185187 | 49.901 |
| 0.3306134259259259 | 49.899 |
| 0.330625 | 49.898 |
| 0.33063657407407404 | 49.897 |
| 0.33064814814814814 | 49.899 |
| 0.33065972222222223 | 49.904 |
| 0.33067129629629627 | 49.905 |
| 0.33068287037037036 | 49.905 |
| 0.33069444444444446 | 49.906 |
| 0.3307060185185185 | 49.908 |
| 0.3307175925925926 | 49.908 |
| 0.3307291666666667 | 49.908 |
| 0.3307407407407407 | 49.911 |
| 0.3307523148148148 | 49.913 |
| 0.3307638888888889 | 49.914 |
| 0.33077546296296295 | 49.912 |
| 0.33078703703703705 | 49.913 |
| 0.33079861111111114 | 49.911 |
| 0.3308101851851852 | 49.91 |
| 0.3308217592592593 | 49.907 |
| 0.3308333333333333 | 49.905 |
| 0.3308449074074074 | 49.899 |
| 0.33085648148148145 | 49.893 |
| 0.3308680555555556 | 49.892 |
| 0.33087962962962963 | 49.891 |
| 0.3308912037037037 | 49.89 |
| 0.33090277777777777 | 49.888 |
| 0.33091435185185186 | 49.887 |
| 0.3309259259259259 | 49.888 |
| 0.3309375 | 49.889 |
| 0.3309490740740741 | 49.892 |
| 0.33096064814814813 | 49.896 |
| 0.3309722222222222 | 49.894 |
| 0.3309837962962963 | 49.895 |
| 0.33099537037037036 | 49.89 |
| 0.33100694444444445 | 49.891 |
| 0.33101851851851855 | 49.893 |
| 0.3310300925925926 | 49.891 |
| 0.3310416666666667 | 49.893 |
| 0.3310532407407408 | 49.888 |
| 0.3310648148148148 | 49.89 |
| 0.33107638888888885 | 49.889 |
| 0.331087962962963 | 49.887 |
| 0.33109953703703704 | 49.891 |
| 0.3311111111111111 | 49.893 |
| 0.3311226851851852 | 49.895 |
| 0.33113425925925927 | 49.899 |
| 0.3311458333333333 | 49.902 |
| 0.3311574074074074 | 49.905 |
| 0.3311689814814815 | 49.908 |
| 0.33118055555555553 | 49.91 |
| 0.33119212962962963 | 49.914 |
| 0.3312037037037037 | 49.917 |
| 0.33121527777777776 | 49.916 |
| 0.33122685185185186 | 49.915 |
| 0.33123842592592595 | 49.912 |
| 0.33125 | 49.91 |
| 0.3312615740740741 | 49.906 |
| 0.3312731481481482 | 49.905 |
| 0.3312847222222222 | 49.903 |
| 0.3312962962962963 | 49.899 |
| 0.3313078703703704 | 49.9 |
| 0.33131944444444444 | 49.901 |
| 0.33133101851851854 | 49.905 |
| 0.3313425925925926 | 49.909 |
| 0.33135416666666667 | 49.909 |
| 0.3313657407407407 | 49.909 |
| 0.3313773148148148 | 49.908 |
| 0.3313888888888889 | 49.91 |
| 0.33140046296296294 | 49.913 |
| 0.33141203703703703 | 49.915 |
| 0.3314236111111111 | 49.919 |
| 0.33143518518518517 | 49.918 |
| 0.33144675925925926 | 49.917 |
| 0.33145833333333335 | 49.918 |
| 0.3314699074074074 | 49.917 |
| 0.3314814814814815 | 49.916 |
| 0.3314930555555556 | 49.916 |
| 0.3315046296296296 | 49.917 |
| 0.3315162037037037 | 49.917 |
| 0.3315277777777778 | 49.916 |
| 0.33153935185185185 | 49.914 |
| 0.33155092592592594 | 49.914 |
| 0.3315625 | 49.913 |
| 0.3315740740740741 | 49.915 |
| 0.3315856481481481 | 49.916 |
| 0.3315972222222222 | 49.922 |
| 0.3316087962962963 | 49.926 |
| 0.33162037037037034 | 49.93 |
| 0.33163194444444444 | 49.934 |
| 0.33164351851851853 | 49.938 |
| 0.33165509259259257 | 49.938 |
| 0.33166666666666667 | 49.943 |
| 0.33167824074074076 | 49.943 |
| 0.3316898148148148 | 49.944 |
| 0.3317013888888889 | 49.943 |
| 0.331712962962963 | 49.939 |
| 0.331724537037037 | 49.938 |
| 0.3317361111111111 | 49.936 |
| 0.3317476851851852 | 49.935 |
| 0.33175925925925925 | 49.935 |
| 0.33177083333333335 | 49.937 |
| 0.3317824074074074 | 49.94 |
| 0.3317939814814815 | 49.943 |
| 0.3318055555555555 | 49.949 |
| 0.33181712962962967 | 49.952 |
| 0.3318287037037037 | 49.953 |
| 0.33184027777777775 | 49.949 |
| 0.33185185185185184 | 49.946 |
| 0.33186342592592594 | 49.945 |
| 0.331875 | 49.945 |
| 0.33188657407407407 | 49.946 |
| 0.33189814814814816 | 49.945 |
| 0.3319097222222222 | 49.946 |
| 0.3319212962962963 | 49.948 |
| 0.3319328703703704 | 49.951 |
| 0.33194444444444443 | 49.952 |
| 0.3319560185185185 | 49.953 |
| 0.3319675925925926 | 49.953 |
| 0.33197916666666666 | 49.951 |
| 0.33199074074074075 | 49.95 |
| 0.33200231481481485 | 49.952 |
| 0.3320138888888889 | 49.951 |
| 0.3320254629629629 | 49.953 |
| 0.3320370370370371 | 49.953 |
| 0.3320486111111111 | 49.952 |
| 0.33206018518518515 | 49.949 |
| 0.33207175925925925 | 49.948 |
| 0.33208333333333334 | 49.947 |
| 0.3320949074074074 | 49.949 |
| 0.3321064814814815 | 49.948 |
| 0.33211805555555557 | 49.95 |
| 0.3321296296296296 | 49.954 |
| 0.3321412037037037 | 49.958 |
| 0.3321527777777778 | 49.961 |
| 0.33216435185185184 | 49.963 |
| 0.33217592592592593 | 49.963 |
| 0.3321875 | 49.965 |
| 0.33219907407407406 | 49.963 |
| 0.33221064814814816 | 49.963 |
| 0.33222222222222225 | 49.963 |
| 0.3322337962962963 | 49.965 |
| 0.33224537037037033 | 49.964 |
| 0.3322569444444445 | 49.963 |
| 0.3322685185185185 | 49.963 |
| 0.3322800925925926 | 49.966 |
| 0.33229166666666665 | 49.97 |
| 0.33230324074074075 | 49.975 |
| 0.3323148148148148 | 49.978 |
| 0.3323263888888889 | 49.981 |
| 0.332337962962963 | 49.982 |
| 0.332349537037037 | 49.985 |
| 0.3323611111111111 | 49.988 |
| 0.3323726851851852 | 49.99 |
| 0.33238425925925924 | 49.988 |
| 0.33239583333333333 | 49.989 |
| 0.33240740740740743 | 49.991 |
| 0.33241898148148147 | 49.995 |
| 0.33243055555555556 | 49.997 |
| 0.33244212962962966 | 50.002 |
| 0.3324537037037037 | 50.01 |
| 0.3324652777777778 | 50.015 |
| 0.3324768518518519 | 50.017 |
| 0.3324884259259259 | 50.017 |
| 0.3325 | 50.018 |
| 0.33251157407407406 | 50.018 |
| 0.33252314814814815 | 50.021 |
| 0.3325347222222222 | 50.026 |
| 0.3325462962962963 | 50.028 |
| 0.3325578703703704 | 50.03 |
| 0.3325694444444444 | 50.03 |
| 0.3325810185185185 | 50.032 |
| 0.3325925925925926 | 50.034 |
| 0.33260416666666665 | 50.032 |
| 0.33261574074074074 | 50.033 |
| 0.33262731481481483 | 50.036 |
| 0.3326388888888889 | 50.036 |
| 0.33265046296296297 | 50.038 |
| 0.33266203703703706 | 50.042 |
| 0.3326736111111111 | 50.044 |
| 0.3326851851851852 | 50.043 |
| 0.3326967592592593 | 50.04 |
| 0.33270833333333333 | 50.04 |
| 0.3327199074074074 | 50.04 |
| 0.33273148148148146 | 50.041 |
| 0.33274305555555556 | 50.041 |
| 0.3327546296296296 | 50.041 |
| 0.3327662037037037 | 50.043 |
| 0.3327777777777778 | 50.044 |
| 0.3327893518518518 | 50.047 |
| 0.3328009259259259 | 50.052 |
| 0.3328125 | 50.055 |
| 0.33282407407407405 | 50.055 |
| 0.33283564814814814 | 50.057 |
| 0.33284722222222224 | 50.06 |
| 0.3328587962962963 | 50.062 |
| 0.33287037037037037 | 50.064 |
| 0.33288194444444447 | 50.063 |
| 0.3328935185185185 | 50.063 |
| 0.3329050925925926 | 50.058 |
| 0.3329166666666667 | 50.059 |
| 0.33292824074074073 | 50.06 |
| 0.3329398148148148 | 50.064 |
| 0.3329513888888889 | 50.071 |
| 0.33296296296296296 | 50.072 |
| 0.332974537037037 | 50.071 |
| 0.33298611111111115 | 50.067 |
| 0.3329976851851852 | 50.063 |
| 0.3330092592592592 | 50.056 |
| 0.3330208333333333 | 50.052 |
| 0.3330324074074074 | 50.049 |
| 0.33304398148148145 | 50.043 |
| 0.33305555555555555 | 50.038 |
| 0.33306712962962964 | 50.034 |
| 0.3330787037037037 | 50.029 |
| 0.3330902777777778 | 50.022 |
| 0.33310185185185187 | 50.021 |
| 0.3331134259259259 | 50.021 |
| 0.333125 | 50.023 |
| 0.3331365740740741 | 50.025 |
| 0.33314814814814814 | 50.029 |
| 0.33315972222222223 | 50.034 |
| 0.3331712962962963 | 50.038 |
| 0.33318287037037037 | 50.042 |
| 0.3331944444444444 | 50.047 |
| 0.33320601851851855 | 50.049 |
| 0.3332175925925926 | 50.05 |
| 0.3332291666666667 | 50.048 |
| 0.3332407407407407 | 50.047 |
| 0.3332523148148148 | 50.047 |
| 0.33326388888888886 | 50.048 |
| 0.33327546296296295 | 50.045 |
| 0.33328703703703705 | 50.042 |
| 0.3332986111111111 | 50.041 |
| 0.3333101851851852 | 50.04 |
| 0.3333217592592593 | 50.039 |